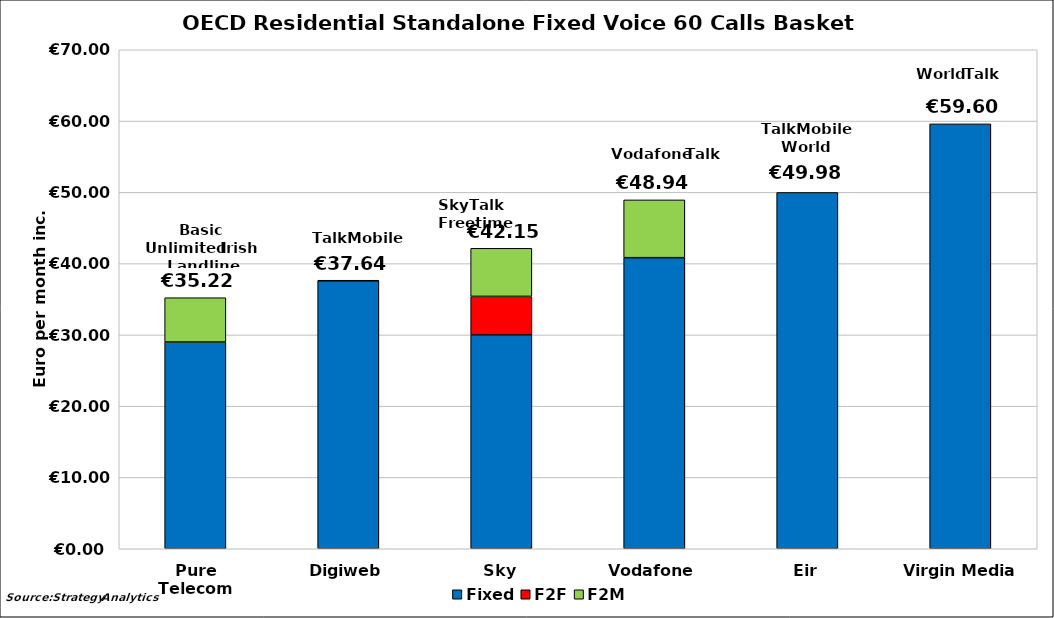
| Category | Fixed | F2F | F2M | Intn |
|---|---|---|---|---|
| Pure Telecom | 29 | 0 | 6.218 | 0 |
| Digiweb | 37.6 | 0 | 0.038 | 0 |
| Sky | 30 | 5.403 | 6.746 | 0 |
| Vodafone | 40.833 | 0 | 8.103 | 0 |
| Eir | 49.98 | 0 | 0 | 0 |
| Virgin Media | 59.6 | 0 | 0 | 0 |